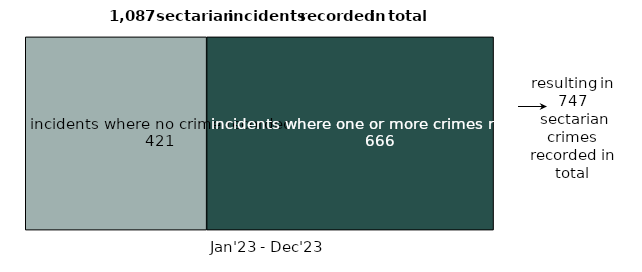
| Category | incidents where no crime recorded | incidents where one or more crimes recorded |
|---|---|---|
| 0 | 421 | 666 |